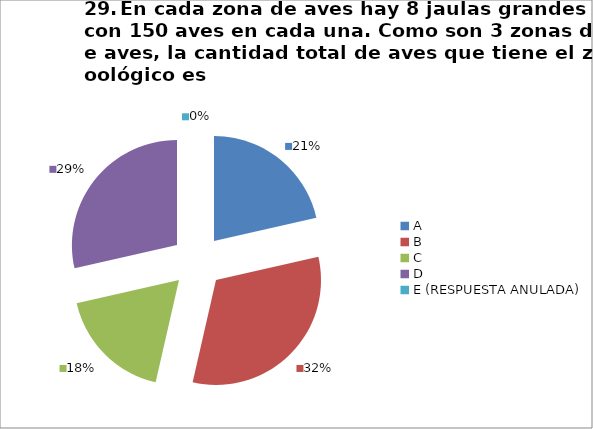
| Category | CANTIDAD DE RESPUESTAS PREGUNTA (29) | PORCENTAJE |
|---|---|---|
| A | 6 | 0.214 |
| B | 9 | 0.321 |
| C | 5 | 0.179 |
| D | 8 | 0.286 |
| E (RESPUESTA ANULADA) | 0 | 0 |